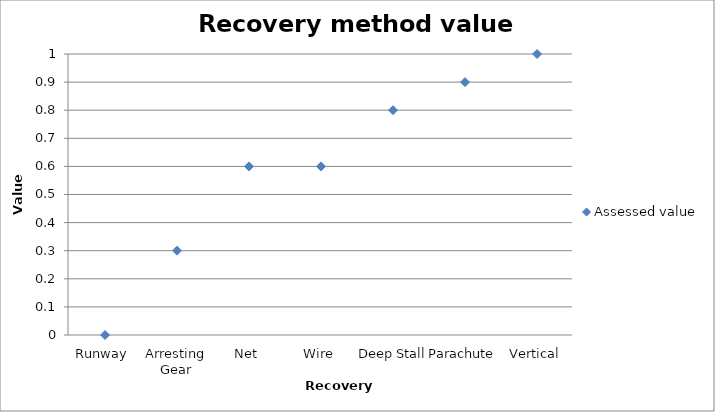
| Category | Assessed value |
|---|---|
| Runway | 0 |
| Arresting Gear | 0.3 |
| Net | 0.6 |
| Wire | 0.6 |
| Deep Stall | 0.8 |
| Parachute | 0.9 |
| Vertical | 1 |